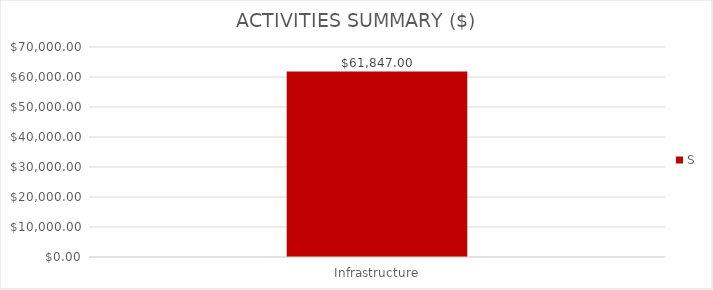
| Category | S |
|---|---|
| Infrastructure | 61847 |